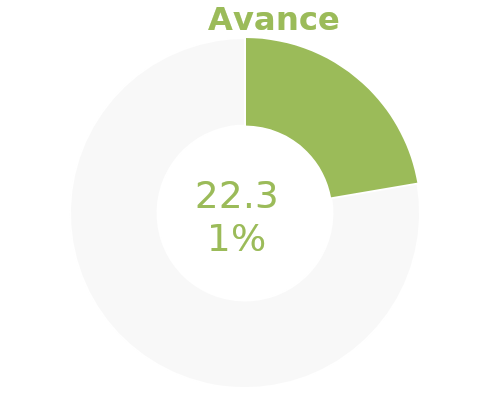
| Category | Series 0 |
|---|---|
| Acumulado 1 Trimestre | 0.223 |
| Año | -0.777 |